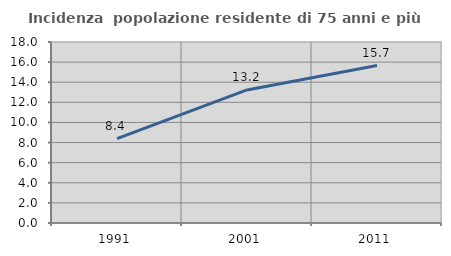
| Category | Incidenza  popolazione residente di 75 anni e più |
|---|---|
| 1991.0 | 8.385 |
| 2001.0 | 13.23 |
| 2011.0 | 15.657 |